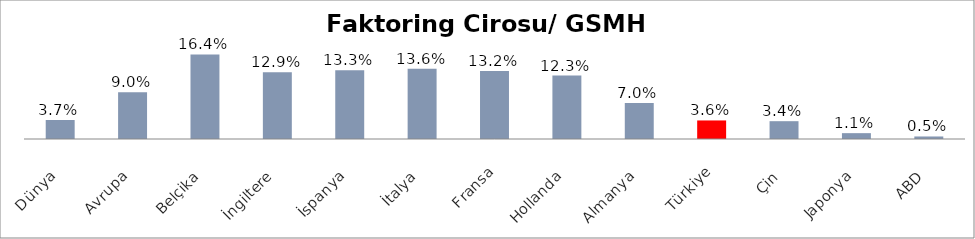
| Category | Faktoring Cirosu/ GSMH (%) |
|---|---|
| Dünya | 0.037 |
| Avrupa | 0.09 |
| Belçika | 0.164 |
| İngiltere | 0.129 |
| İspanya | 0.133 |
| İtalya | 0.136 |
| Fransa | 0.132 |
| Hollanda | 0.123 |
| Almanya | 0.07 |
| Türkiye | 0.036 |
| Çin | 0.034 |
| Japonya | 0.011 |
| ABD | 0.005 |